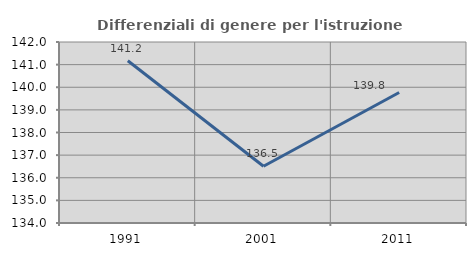
| Category | Differenziali di genere per l'istruzione superiore |
|---|---|
| 1991.0 | 141.17 |
| 2001.0 | 136.507 |
| 2011.0 | 139.768 |